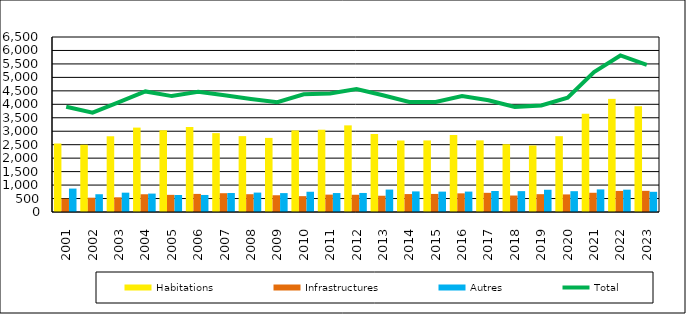
| Category | Habitations | Infrastructures | Autres |
|---|---|---|---|
| 2001.0 | 2544 | 496 | 870 |
| 2002.0 | 2499 | 531 | 660 |
| 2003.0 | 2813 | 546 | 718 |
| 2004.0 | 3135 | 659 | 684 |
| 2005.0 | 3037 | 637 | 631 |
| 2006.0 | 3161 | 672 | 633 |
| 2007.0 | 2930 | 698 | 705 |
| 2008.0 | 2818 | 661 | 721 |
| 2009.0 | 2752 | 622 | 702 |
| 2010.0 | 3031 | 589 | 752 |
| 2011.0 | 3056 | 645 | 704 |
| 2012.0 | 3218 | 640 | 707 |
| 2013.0 | 2898 | 604 | 833 |
| 2014.0 | 2655 | 666 | 765 |
| 2015.0 | 2658 | 671 | 757 |
| 2016.0 | 2859 | 693 | 758 |
| 2017.0 | 2661 | 712 | 780 |
| 2018.0 | 2518 | 612 | 775 |
| 2019.0 | 2471 | 662 | 826 |
| 2020.0 | 2816 | 653 | 773 |
| 2021.0 | 3647 | 714 | 839 |
| 2022.0 | 4202 | 783 | 829 |
| 2023.0 | 3931 | 786 | 750 |